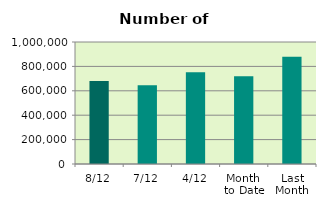
| Category | Series 0 |
|---|---|
| 8/12 | 681116 |
| 7/12 | 645132 |
| 4/12 | 751702 |
| Month 
to Date | 720097.333 |
| Last
Month | 879957.333 |